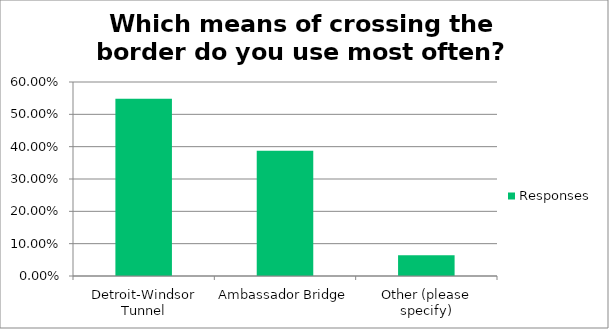
| Category | Responses |
|---|---|
| Detroit-Windsor Tunnel | 0.548 |
| Ambassador Bridge | 0.387 |
| Other (please specify) | 0.064 |